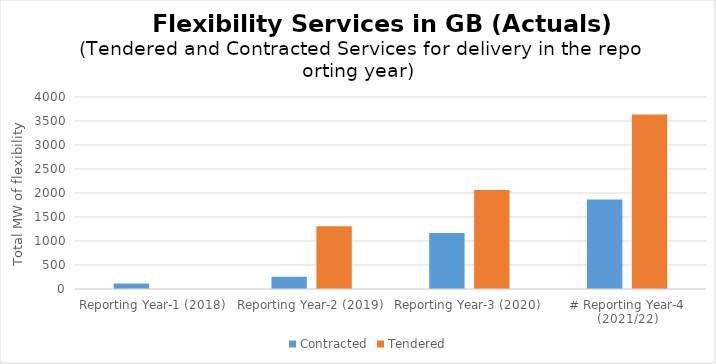
| Category | Contracted | Tendered |
|---|---|---|
| Reporting Year-1 (2018) | 116.1 | 0 |
| Reporting Year-2 (2019) | 256.15 | 1306.349 |
| Reporting Year-3 (2020) | 1165.547 | 2064.516 |
| # Reporting Year-4 (2021/22) | 1867.01 | 3634.757 |